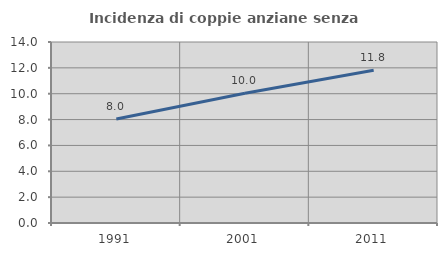
| Category | Incidenza di coppie anziane senza figli  |
|---|---|
| 1991.0 | 8.041 |
| 2001.0 | 10.04 |
| 2011.0 | 11.818 |